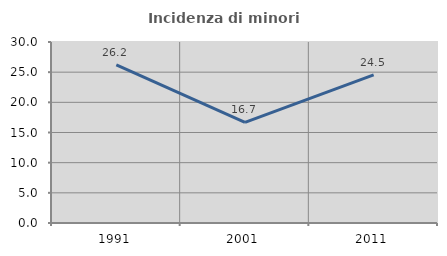
| Category | Incidenza di minori stranieri |
|---|---|
| 1991.0 | 26.19 |
| 2001.0 | 16.667 |
| 2011.0 | 24.543 |